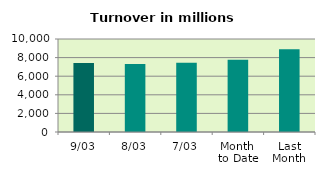
| Category | Series 0 |
|---|---|
| 9/03 | 7409.56 |
| 8/03 | 7313.478 |
| 7/03 | 7447.839 |
| Month 
to Date | 7759.963 |
| Last
Month | 8884.685 |